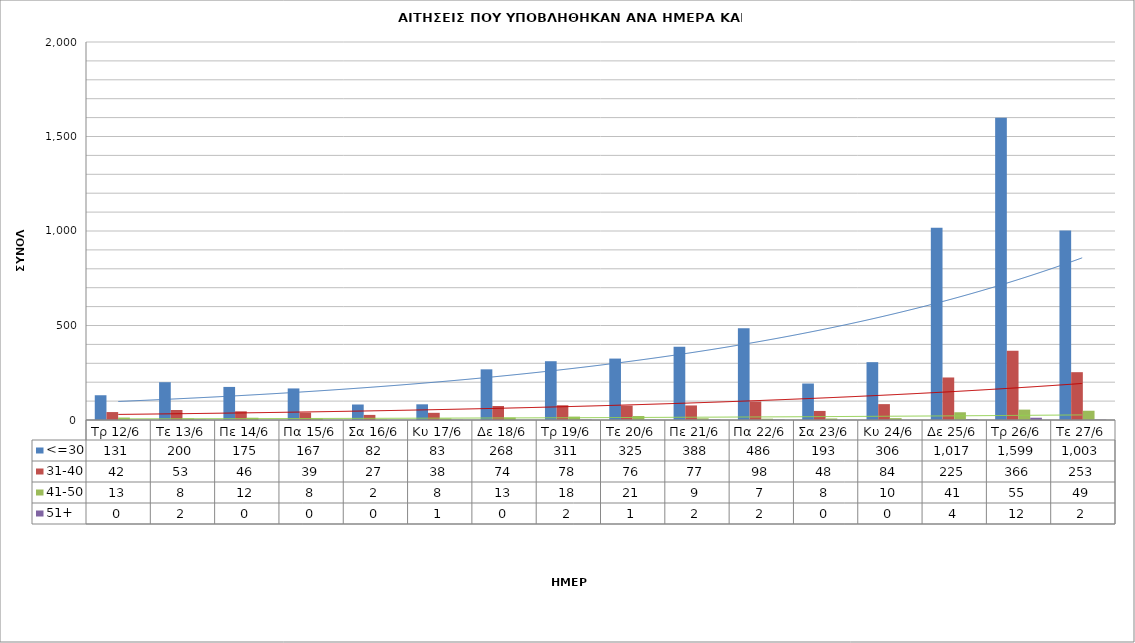
| Category | <=30 | 31-40 | 41-50 | 51+ |
|---|---|---|---|---|
| Τρ 12/6 | 131 | 42 | 13 | 0 |
| Τε 13/6 | 200 | 53 | 8 | 2 |
| Πε 14/6 | 175 | 46 | 12 | 0 |
| Πα 15/6 | 167 | 39 | 8 | 0 |
| Σα 16/6 | 82 | 27 | 2 | 0 |
| Κυ 17/6 | 83 | 38 | 8 | 1 |
| Δε 18/6 | 268 | 74 | 13 | 0 |
| Τρ 19/6 | 311 | 78 | 18 | 2 |
| Τε 20/6 | 325 | 76 | 21 | 1 |
| Πε 21/6 | 388 | 77 | 9 | 2 |
| Πα 22/6 | 486 | 98 | 7 | 2 |
| Σα 23/6 | 193 | 48 | 8 | 0 |
| Κυ 24/6 | 306 | 84 | 10 | 0 |
| Δε 25/6 | 1017 | 225 | 41 | 4 |
| Τρ 26/6 | 1599 | 366 | 55 | 12 |
| Τε 27/6 | 1003 | 253 | 49 | 2 |